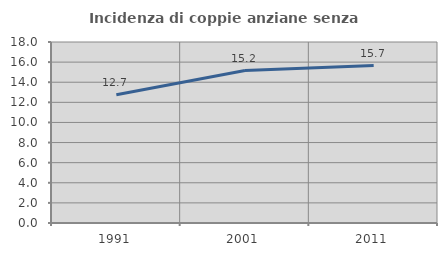
| Category | Incidenza di coppie anziane senza figli  |
|---|---|
| 1991.0 | 12.748 |
| 2001.0 | 15.157 |
| 2011.0 | 15.652 |